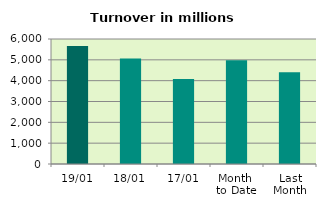
| Category | Series 0 |
|---|---|
| 19/01 | 5667.316 |
| 18/01 | 5068.044 |
| 17/01 | 4082.608 |
| Month 
to Date | 4975.027 |
| Last
Month | 4407.558 |